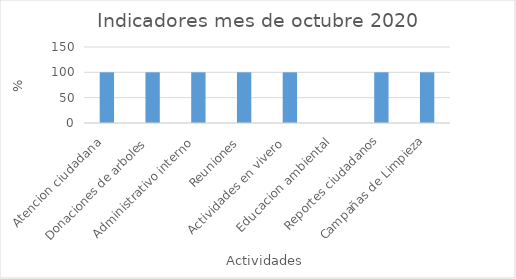
| Category | Series 0 |
|---|---|
| Atencion ciudadana  | 100 |
| Donaciones de arboles  | 100 |
| Administrativo interno  | 100 |
| Reuniones  | 100 |
| Actividades en vivero  | 100 |
| Educacion ambiental  | 0 |
| Reportes ciudadanos | 100 |
| Campañas de Limpieza | 100 |